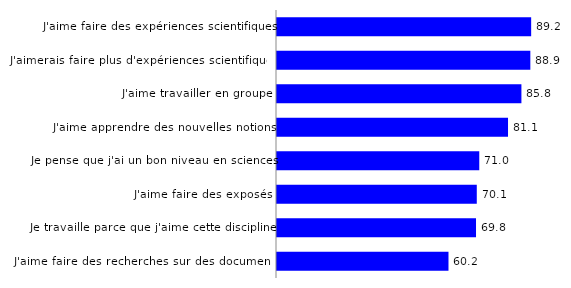
| Category | Series 0 |
|---|---|
| J'aime faire des recherches sur des documents | 60.17 |
| Je travaille parce que j'aime cette discipline | 69.83 |
| J'aime faire des exposés | 70.1 |
| Je pense que j'ai un bon niveau en sciences | 70.97 |
| J'aime apprendre des nouvelles notions | 81.06 |
| J'aime travailler en groupe | 85.76 |
| J'aimerais faire plus d'expériences scientifiques | 88.89 |
| J'aime faire des expériences scientifiques | 89.18 |